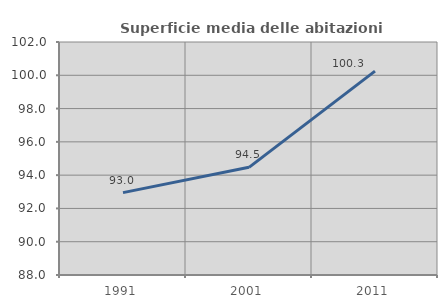
| Category | Superficie media delle abitazioni occupate |
|---|---|
| 1991.0 | 92.95 |
| 2001.0 | 94.469 |
| 2011.0 | 100.251 |